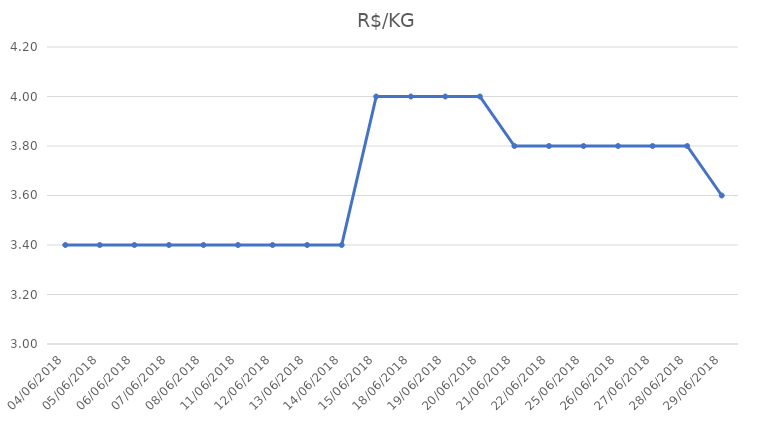
| Category | R$/KG |
|---|---|
| 04/06/2018 | 3.4 |
| 05/06/2018 | 3.4 |
| 06/06/2018 | 3.4 |
| 07/06/2018 | 3.4 |
| 08/06/2018 | 3.4 |
| 11/06/2018 | 3.4 |
| 12/06/2018 | 3.4 |
| 13/06/2018 | 3.4 |
| 14/06/2018 | 3.4 |
| 15/06/2018 | 4 |
| 18/06/2018 | 4 |
| 19/06/2018 | 4 |
| 20/06/2018 | 4 |
| 21/06/2018 | 3.8 |
| 22/06/2018 | 3.8 |
| 25/06/2018 | 3.8 |
| 26/06/2018 | 3.8 |
| 27/06/2018 | 3.8 |
| 28/06/2018 | 3.8 |
| 29/06/2018 | 3.6 |